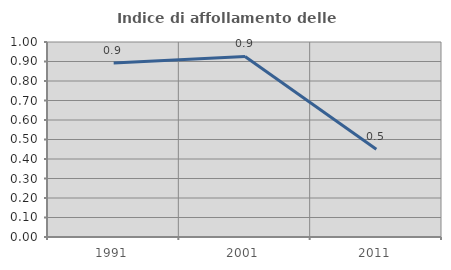
| Category | Indice di affollamento delle abitazioni  |
|---|---|
| 1991.0 | 0.893 |
| 2001.0 | 0.926 |
| 2011.0 | 0.45 |